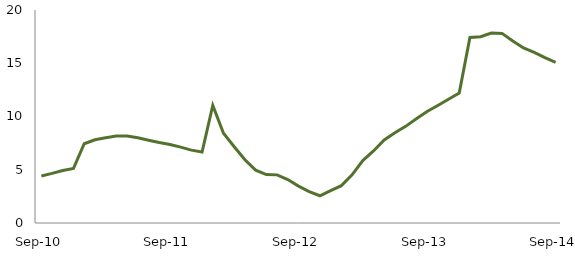
| Category | Series 0 |
|---|---|
| Sep-10 | 4.42 |
|  | 4.657 |
|  | 4.929 |
|  | 5.12 |
|  | 7.444 |
|  | 7.818 |
|  | 8.012 |
|  | 8.161 |
|  | 8.168 |
|  | 8.004 |
|  | 7.769 |
|  | 7.555 |
| Sep-11 | 7.367 |
|  | 7.122 |
|  | 6.84 |
|  | 6.661 |
|  | 11.044 |
|  | 8.43 |
|  | 7.165 |
|  | 5.933 |
|  | 4.965 |
|  | 4.549 |
|  | 4.519 |
|  | 4.08 |
| Sep-12 | 3.461 |
|  | 2.94 |
|  | 2.557 |
|  | 3.045 |
|  | 3.508 |
|  | 4.519 |
|  | 5.862 |
|  | 6.765 |
|  | 7.803 |
|  | 8.471 |
|  | 9.075 |
|  | 9.787 |
| Sep-13 | 10.468 |
|  | 11.036 |
|  | 11.622 |
|  | 12.2 |
|  | 17.421 |
|  | 17.488 |
|  | 17.829 |
|  | 17.803 |
|  | 17.087 |
|  | 16.432 |
|  | 16.015 |
|  | 15.52 |
| Sep-14 | 15.089 |